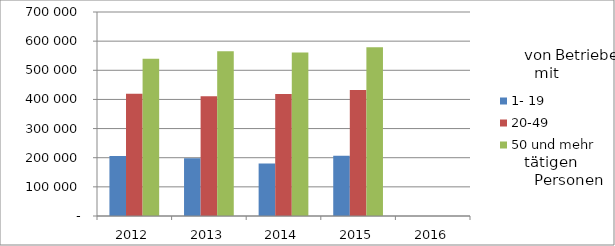
| Category | 1- 19 | 20-49 | 50 und mehr |
|---|---|---|---|
| 2012.0 | 205869.761 | 419212.589 | 539878.342 |
| 2013.0 | 198520.981 | 411220.539 | 565167.223 |
| 2014.0 | 180326.18 | 418921.142 | 560768.499 |
| 2015.0 | 206882.453 | 432377.754 | 578872.572 |
| 2016.0 | 0 | 0 | 0 |